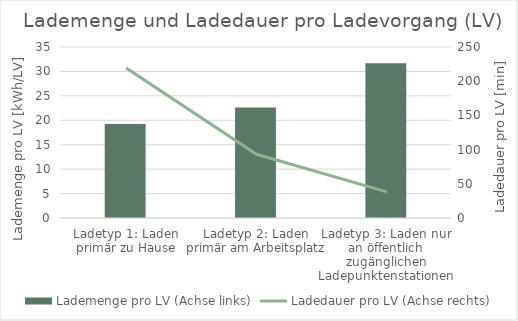
| Category | Lademenge pro LV (Achse links) |
|---|---|
| Ladetyp 1: Laden primär zu Hause | 19.258 |
| Ladetyp 2: Laden primär am Arbeitsplatz | 22.597 |
| Ladetyp 3: Laden nur an öffentlich zugänglichen Ladepunktenstationen | 31.658 |